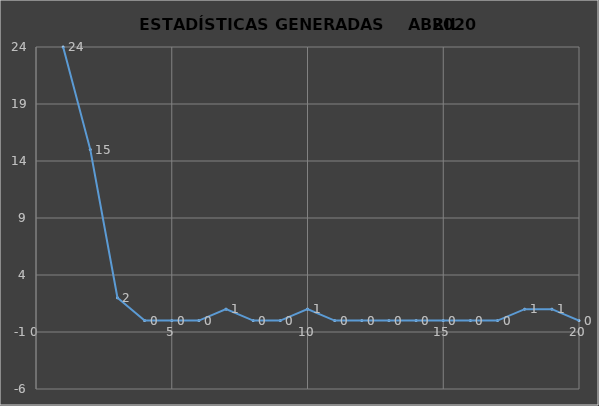
| Category |                   ESTADÍSTICAS GENERADAS     PERIODO ABRIL 2020 CANTIDAD |
|---|---|
| 0 | 24 |
| 1 | 15 |
| 2 | 2 |
| 3 | 0 |
| 4 | 0 |
| 5 | 0 |
| 6 | 1 |
| 7 | 0 |
| 8 | 0 |
| 9 | 1 |
| 10 | 0 |
| 11 | 0 |
| 12 | 0 |
| 13 | 0 |
| 14 | 0 |
| 15 | 0 |
| 16 | 0 |
| 17 | 1 |
| 18 | 1 |
| 19 | 0 |